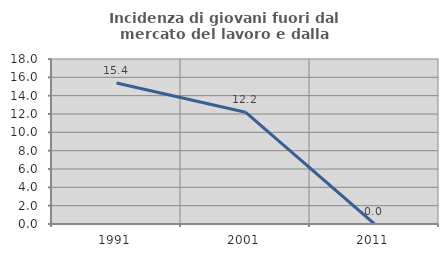
| Category | Incidenza di giovani fuori dal mercato del lavoro e dalla formazione  |
|---|---|
| 1991.0 | 15.385 |
| 2001.0 | 12.195 |
| 2011.0 | 0 |